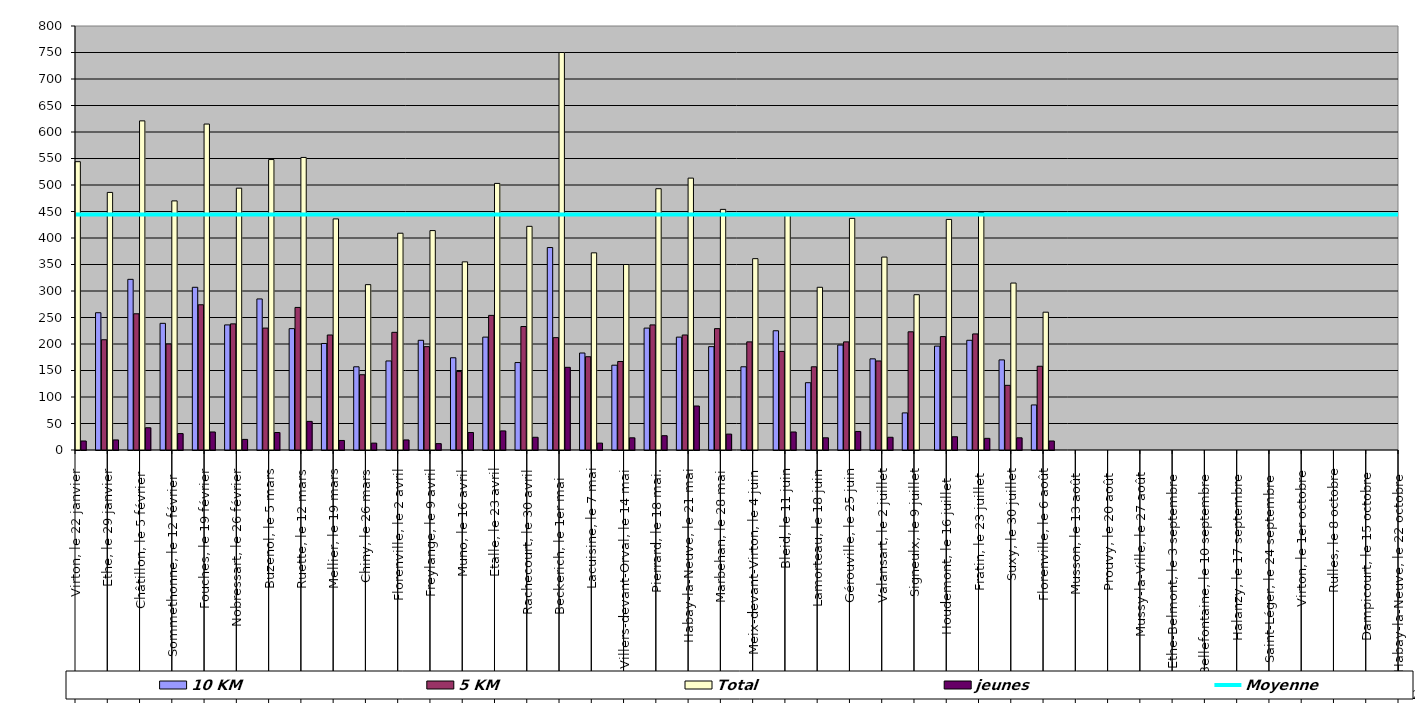
| Category | 10 KM | 5 KM | Total | jeunes |
|---|---|---|---|---|
| 0 | 296 | 231 | 544 | 17 |
| 1 | 259 | 208 | 486 | 19 |
| 2 | 322 | 257 | 621 | 42 |
| 3 | 239 | 200 | 470 | 31 |
| 4 | 307 | 274 | 615 | 34 |
| 5 | 236 | 238 | 494 | 20 |
| 6 | 285 | 230 | 548 | 33 |
| 7 | 229 | 269 | 552 | 54 |
| 8 | 201 | 217 | 436 | 18 |
| 9 | 157 | 142 | 312 | 13 |
| 10 | 168 | 222 | 409 | 19 |
| 11 | 207 | 195 | 414 | 12 |
| 12 | 174 | 148 | 355 | 33 |
| 13 | 213 | 254 | 503 | 36 |
| 14 | 165 | 233 | 422 | 24 |
| 15 | 382 | 212 | 750 | 156 |
| 16 | 183 | 176 | 372 | 13 |
| 17 | 160 | 167 | 350 | 23 |
| 18 | 230 | 236 | 493 | 27 |
| 19 | 213 | 217 | 513 | 83 |
| 20 | 195 | 229 | 454 | 30 |
| 21 | 157 | 204 | 361 | 0 |
| 22 | 225 | 186 | 445 | 34 |
| 23 | 127 | 157 | 307 | 23 |
| 24 | 198 | 204 | 437 | 35 |
| 25 | 172 | 168 | 364 | 24 |
| 26 | 70 | 223 | 293 | 0 |
| 27 | 196 | 214 | 435 | 25 |
| 28 | 207 | 219 | 448 | 22 |
| 29 | 170 | 122 | 315 | 23 |
| 30 | 85 | 158 | 260 | 17 |
| 31 | 0 | 0 | 0 | 0 |
| 32 | 0 | 0 | 0 | 0 |
| 33 | 0 | 0 | 0 | 0 |
| 34 | 0 | 0 | 0 | 0 |
| 35 | 0 | 0 | 0 | 0 |
| 36 | 0 | 0 | 0 | 0 |
| 37 | 0 | 0 | 0 | 0 |
| 38 | 0 | 0 | 0 | 0 |
| 39 | 0 | 0 | 0 | 0 |
| 40 | 0 | 0 | 0 | 0 |
| 41 | 0 | 0 | 0 | 0 |